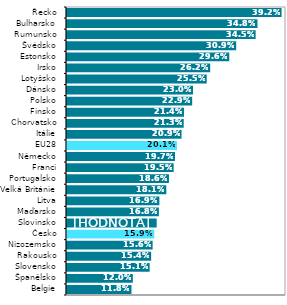
| Category | Series 0 |
|---|---|
| Belgie | 0.118 |
| Španělsko | 0.12 |
| Slovensko | 0.151 |
| Rakousko | 0.154 |
| Nizozemsko | 0.156 |
| Česko | 0.159 |
| Slovinsko | 0.164 |
| Maďarsko | 0.168 |
| Litva | 0.169 |
| Velká Británie | 0.181 |
| Portugalsko | 0.186 |
| Franci | 0.195 |
| Německo | 0.197 |
| EU28 | 0.201 |
| Itálie | 0.209 |
| Chorvatsko | 0.213 |
| Finsko | 0.214 |
| Polsko | 0.229 |
| Dánsko | 0.23 |
| Lotyšsko | 0.255 |
| Irsko | 0.262 |
| Estonsko | 0.296 |
| Švédsko | 0.309 |
| Rumunsko | 0.345 |
| Bulharsko | 0.348 |
| Řecko | 0.392 |